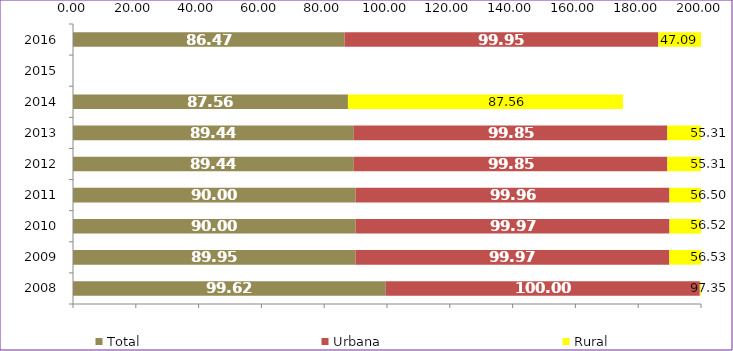
| Category | Total | Urbana | Rural |
|---|---|---|---|
| 2008.0 | 99.62 | 100 | 97.35 |
| 2009.0 | 89.95 | 99.97 | 56.53 |
| 2010.0 | 90 | 99.97 | 56.52 |
| 2011.0 | 90 | 99.96 | 56.5 |
| 2012.0 | 89.44 | 99.85 | 55.31 |
| 2013.0 | 89.44 | 99.85 | 55.31 |
| 2014.0 | 87.56 | 0 | 87.56 |
| 2015.0 | 0 | 0 | 0 |
| 2016.0 | 86.47 | 99.95 | 47.09 |